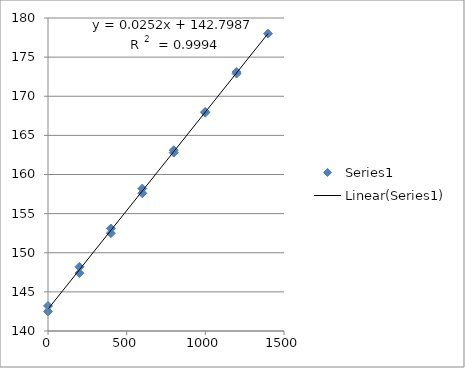
| Category | Series 0 |
|---|---|
| 0.0 | 142.5 |
| 199.8 | 147.4 |
| 399.6 | 152.5 |
| 599.4000000000001 | 157.6 |
| 799.2 | 162.8 |
| 999.0 | 167.9 |
| 1198.8000000000002 | 172.9 |
| 1398.6000000000001 | 178 |
| 1198.8000000000002 | 173.1 |
| 999.0 | 168 |
| 799.2 | 163.1 |
| 599.4000000000001 | 158.2 |
| 399.6 | 153.1 |
| 199.8 | 148.2 |
| 0.0 | 143.2 |